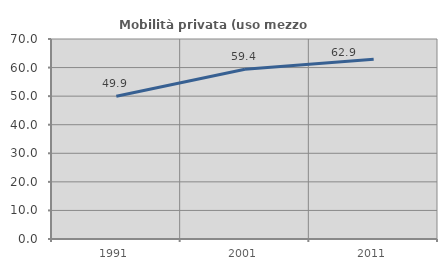
| Category | Mobilità privata (uso mezzo privato) |
|---|---|
| 1991.0 | 49.949 |
| 2001.0 | 59.399 |
| 2011.0 | 62.94 |